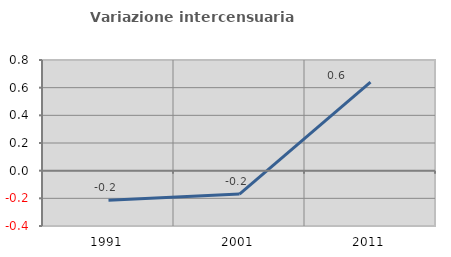
| Category | Variazione intercensuaria annua |
|---|---|
| 1991.0 | -0.214 |
| 2001.0 | -0.169 |
| 2011.0 | 0.641 |